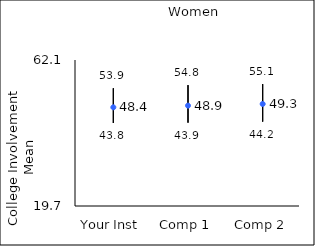
| Category | 25th percentile | 75th percentile | Mean |
|---|---|---|---|
| Your Inst | 43.8 | 53.9 | 48.36 |
| Comp 1 | 43.9 | 54.8 | 48.85 |
| Comp 2 | 44.2 | 55.1 | 49.33 |